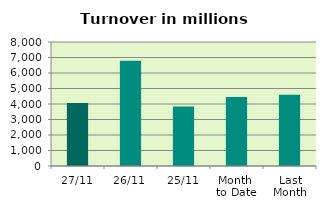
| Category | Series 0 |
|---|---|
| 27/11 | 4064.066 |
| 26/11 | 6797.705 |
| 25/11 | 3831.904 |
| Month 
to Date | 4450.328 |
| Last
Month | 4589.98 |